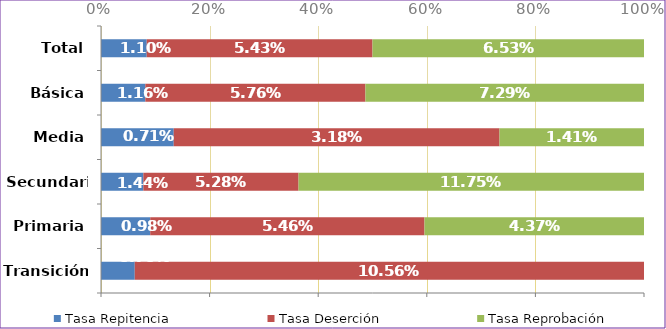
| Category | Tasa Repitencia | Tasa Deserción | Tasa Reprobación |
|---|---|---|---|
| Transición | 0.007 | 0.106 | 0 |
| Primaria | 0.01 | 0.055 | 0.044 |
| Secundaria | 0.014 | 0.053 | 0.118 |
| Media | 0.007 | 0.032 | 0.014 |
| Básica | 0.012 | 0.058 | 0.073 |
| Total | 0.011 | 0.054 | 0.065 |